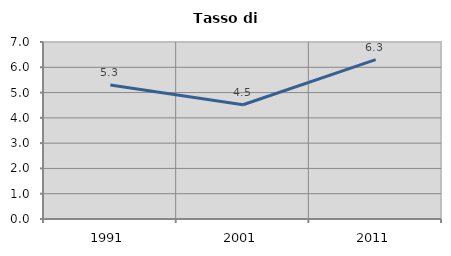
| Category | Tasso di disoccupazione   |
|---|---|
| 1991.0 | 5.299 |
| 2001.0 | 4.518 |
| 2011.0 | 6.301 |